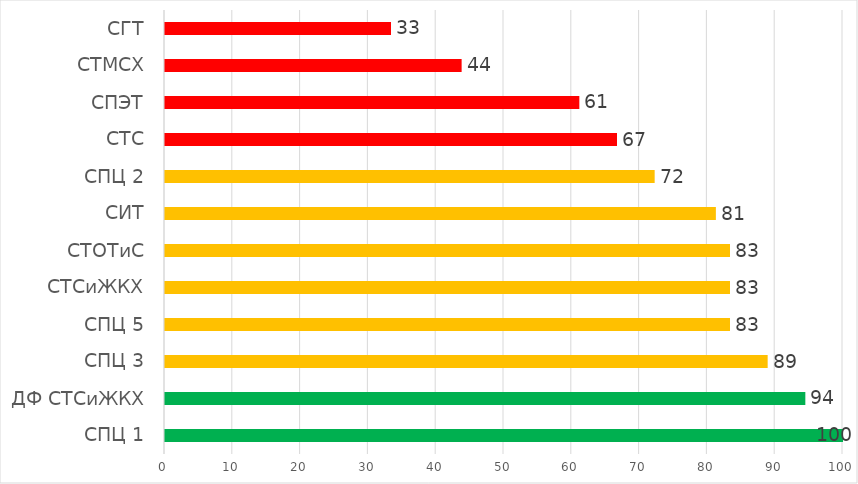
| Category | Series 0 |
|---|---|
| СПЦ 1 | 100 |
| ДФ СТСиЖКХ | 94.444 |
| СПЦ 3 | 88.889 |
| СПЦ 5 | 83.333 |
| СТСиЖКХ | 83.333 |
| СТОТиС | 83.333 |
| СИТ | 81.25 |
| СПЦ 2 | 72.222 |
| СТС | 66.667 |
| СПЭТ | 61.111 |
| СТМСХ | 43.75 |
| СГТ | 33.333 |